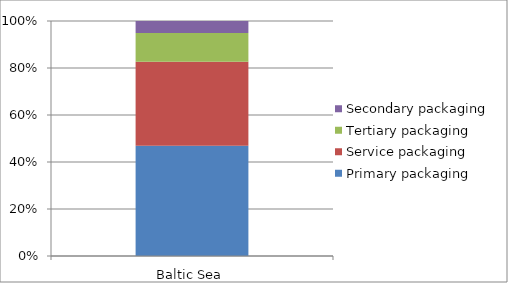
| Category | Primary packaging | Service packaging | Tertiary packaging | Secondary packaging |
|---|---|---|---|---|
| Baltic Sea | 3588 | 2734 | 937 | 387 |